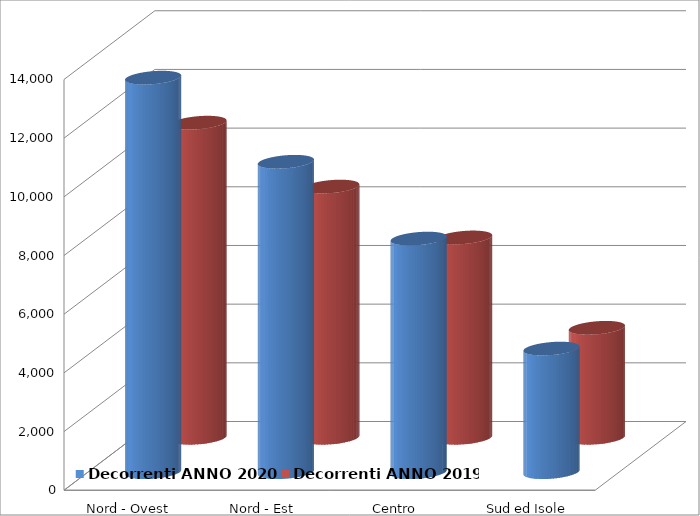
| Category | Decorrenti ANNO 2020 | Decorrenti ANNO 2019 |
|---|---|---|
| Nord - Ovest | 13447 | 10741 |
| Nord - Est | 10580 | 8563 |
| Centro | 7962 | 6829 |
| Sud ed Isole | 4213 | 3750 |